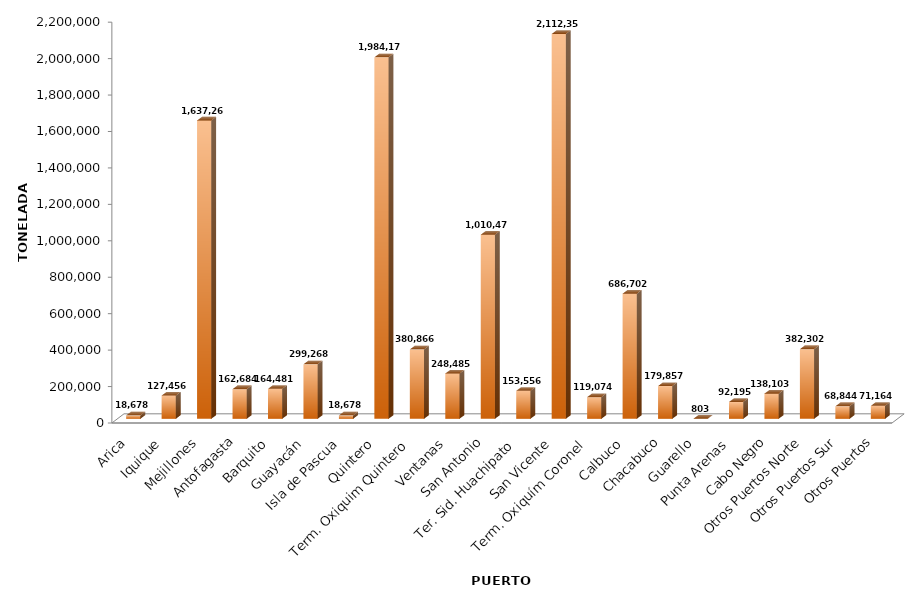
| Category | Series 0 |
|---|---|
|  Arica  | 18677.813 |
|  Iquique  | 127456.392 |
|  Mejillones  | 1637259.59 |
|  Antofagasta  | 162683.513 |
|  Barquito  | 164481.246 |
|  Guayacán  | 299267.611 |
|  Isla de Pascua  | 18677.648 |
|  Quintero  | 1984174.375 |
|  Term. Oxiquim Quintero  | 380865.936 |
|  Ventanas  | 248484.716 |
|  San Antonio  | 1010470.331 |
|  Ter. Sid. Huachipato  | 153555.997 |
|  San Vicente  | 2112357.575 |
|  Term. Oxiquím Coronel  | 119074.479 |
|  Calbuco  | 686701.5 |
|  Chacabuco  | 179857.275 |
|  Guarello  | 802.772 |
|  Punta Arenas  | 92195.373 |
|  Cabo Negro  | 138103 |
|  Otros Puertos Norte  | 382302.029 |
|  Otros Puertos Sur  | 68843.867 |
|  Otros Puertos  | 71163.766 |